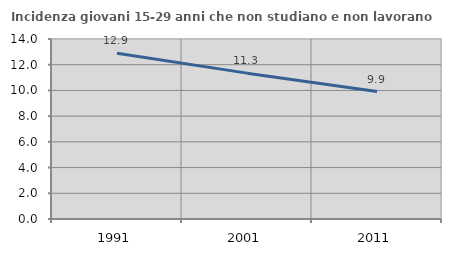
| Category | Incidenza giovani 15-29 anni che non studiano e non lavorano  |
|---|---|
| 1991.0 | 12.888 |
| 2001.0 | 11.345 |
| 2011.0 | 9.91 |